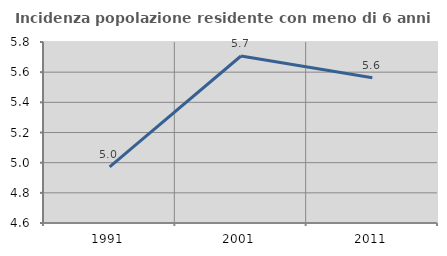
| Category | Incidenza popolazione residente con meno di 6 anni |
|---|---|
| 1991.0 | 4.973 |
| 2001.0 | 5.707 |
| 2011.0 | 5.564 |